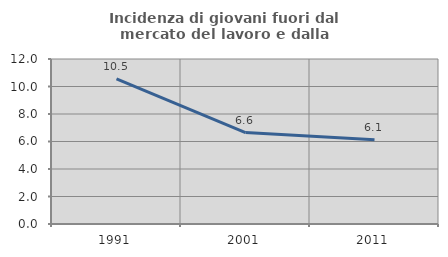
| Category | Incidenza di giovani fuori dal mercato del lavoro e dalla formazione  |
|---|---|
| 1991.0 | 10.549 |
| 2001.0 | 6.648 |
| 2011.0 | 6.135 |